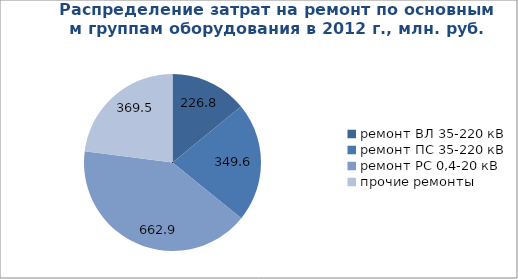
| Category | 2012 |
|---|---|
| ремонт ВЛ 35-220 кВ | 226.8 |
| ремонт ПС 35-220 кВ | 349.6 |
| ремонт РС 0,4-20 кВ | 662.9 |
| прочие ремонты | 369.5 |